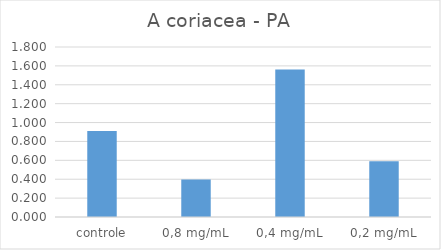
| Category | Series 0 |
|---|---|
| controle | 0.91 |
| 0,8 mg/mL | 0.396 |
| 0,4 mg/mL | 1.562 |
| 0,2 mg/mL | 0.59 |